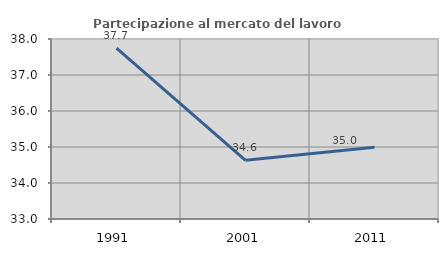
| Category | Partecipazione al mercato del lavoro  femminile |
|---|---|
| 1991.0 | 37.745 |
| 2001.0 | 34.631 |
| 2011.0 | 34.993 |